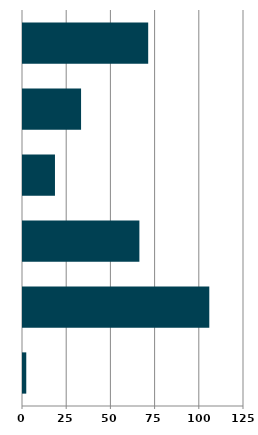
| Category | Series 0 |
|---|---|
| 0 | 1.848 |
| 1 | 105.373 |
| 2 | 65.832 |
| 3 | 18.083 |
| 4 | 32.844 |
| 5 | 70.813 |